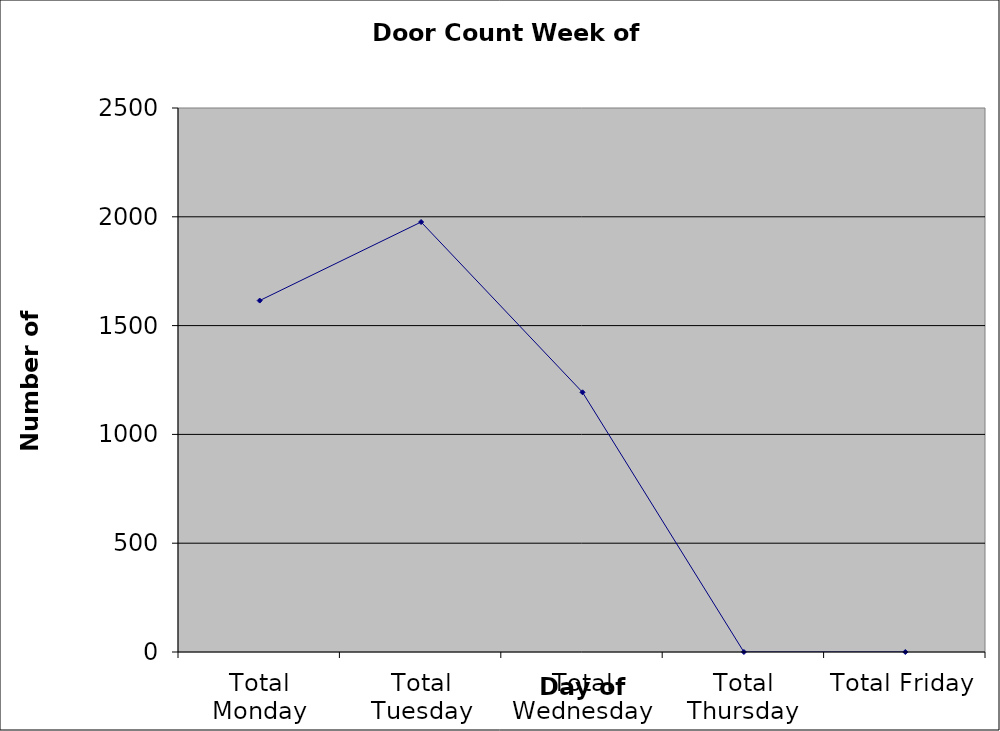
| Category | Series 0 |
|---|---|
| Total Monday | 1615 |
| Total Tuesday | 1976 |
| Total Wednesday | 1193.5 |
| Total Thursday | 0 |
| Total Friday | 0 |